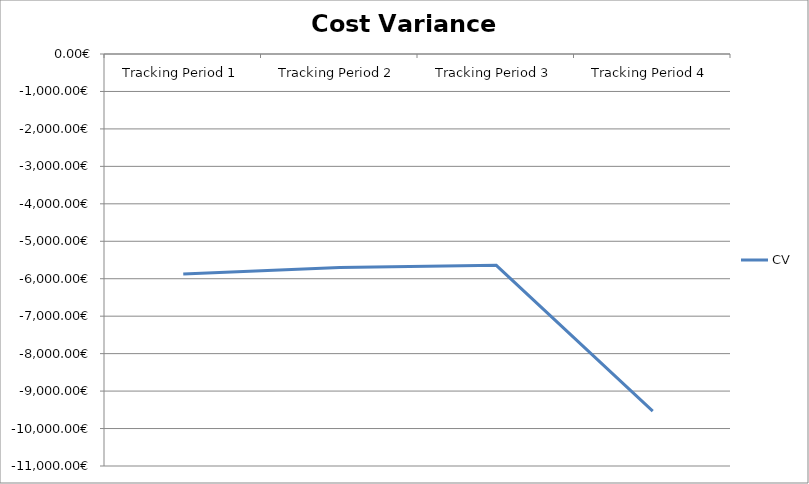
| Category | CV |
|---|---|
| Tracking Period 1 | -5876 |
| Tracking Period 2 | -5701 |
| Tracking Period 3 | -5643 |
| Tracking Period 4 | -9537 |